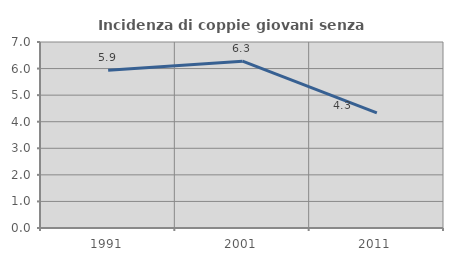
| Category | Incidenza di coppie giovani senza figli |
|---|---|
| 1991.0 | 5.936 |
| 2001.0 | 6.278 |
| 2011.0 | 4.329 |